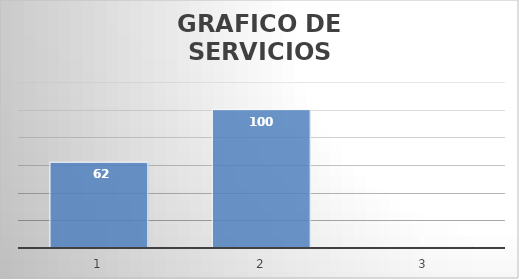
| Category | Series 0 |
|---|---|
| 0 | 62 |
| 1 | 100 |
| 2 | 1 |